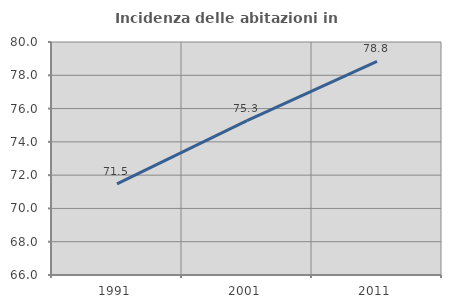
| Category | Incidenza delle abitazioni in proprietà  |
|---|---|
| 1991.0 | 71.481 |
| 2001.0 | 75.27 |
| 2011.0 | 78.842 |